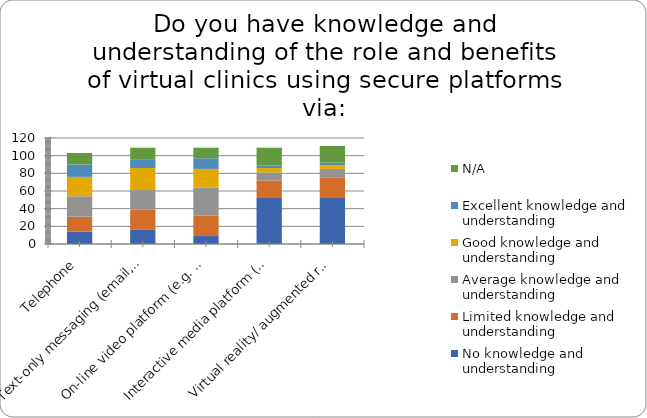
| Category | No knowledge and understanding | Limited knowledge and understanding | Average knowledge and understanding | Good knowledge and understanding | Excellent knowledge and understanding | N/A |
|---|---|---|---|---|---|---|
| Telephone | 14 | 17 | 23 | 22 | 14 | 13 |
| Text-only messaging (email, instant messaging) | 16 | 23 | 22 | 25 | 10 | 13 |
| On-line video platform (e.g. Skype, Zoom, Attend Anywhere) | 9 | 23 | 32 | 21 | 12 | 12 |
| Interactive media platform (e.g. Physitrack) | 52 | 20 | 9 | 5 | 3 | 20 |
| Virtual reality/ augmented reality platforms | 52 | 23 | 10 | 4 | 3 | 19 |